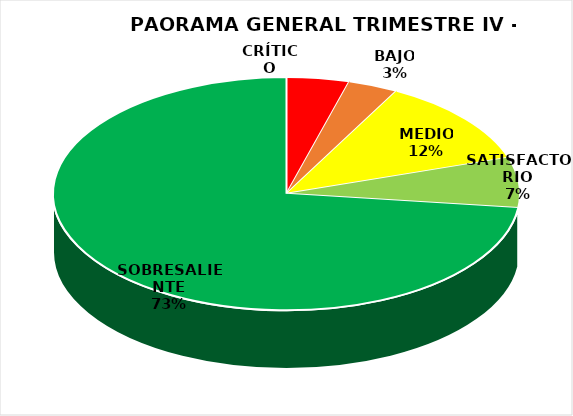
| Category | Series 0 |
|---|---|
| CRÍTICO | 5 |
| BAJO | 4 |
| MEDIO | 14 |
| SATISFACTORIO | 8 |
| SOBRESALIENTE | 84 |